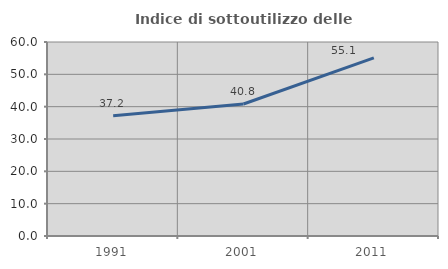
| Category | Indice di sottoutilizzo delle abitazioni  |
|---|---|
| 1991.0 | 37.217 |
| 2001.0 | 40.826 |
| 2011.0 | 55.105 |